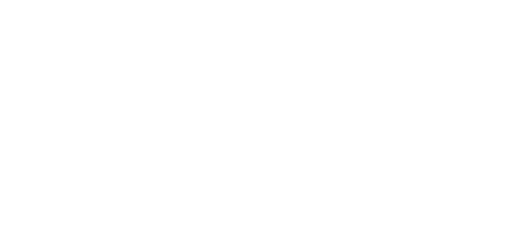
| Category | Pagrindinė sumokėta suma | Sumokėtos palūkanos |
|---|---|---|
| 2019 | 316.351 | 226.28 |
| 2020 | 1105.769 | 739.178 |
| 2021 | 1939.715 | 1207.547 |
| 2022 | 2820.703 | 1628.874 |
| 2023 | 3751.386 | 2000.507 |
| 2024 | 4734.566 | 2319.642 |
| 2025 | 5773.206 | 2583.318 |
| 2026 | 6870.433 | 2788.406 |
| 2027 | 8029.552 | 2931.602 |
| 2028 | 9254.054 | 3009.415 |
| 2029 | 10000 | 3023.153 |